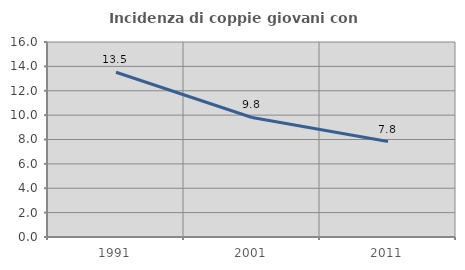
| Category | Incidenza di coppie giovani con figli |
|---|---|
| 1991.0 | 13.519 |
| 2001.0 | 9.806 |
| 2011.0 | 7.831 |